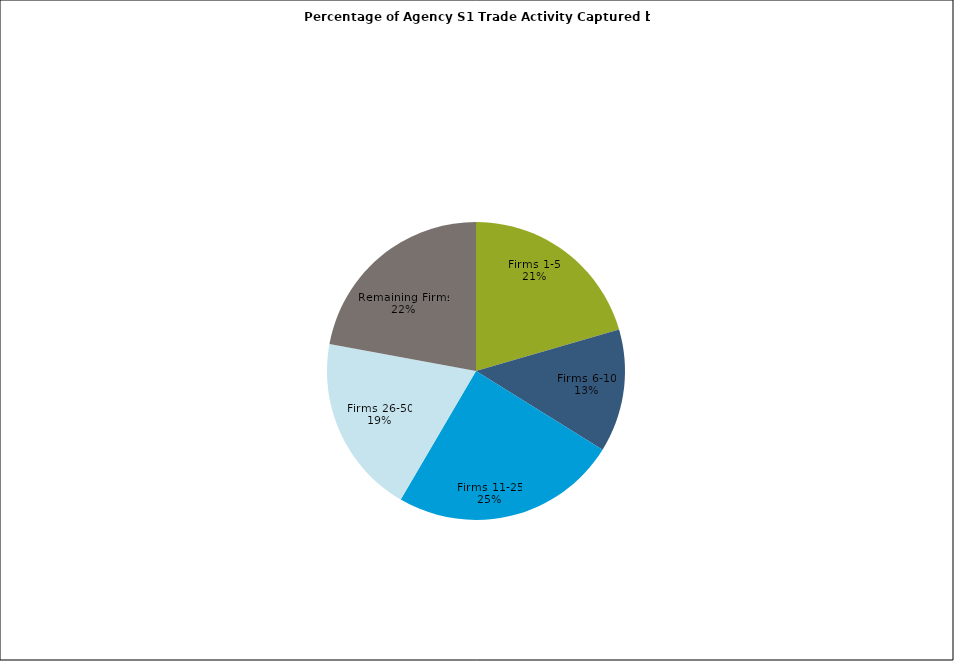
| Category | Series 0 |
|---|---|
| Firms 1-5 | 0.205 |
| Firms 6-10 | 0.134 |
| Firms 11-25 | 0.246 |
| Firms 26-50 | 0.195 |
| Remaining Firms | 0.221 |